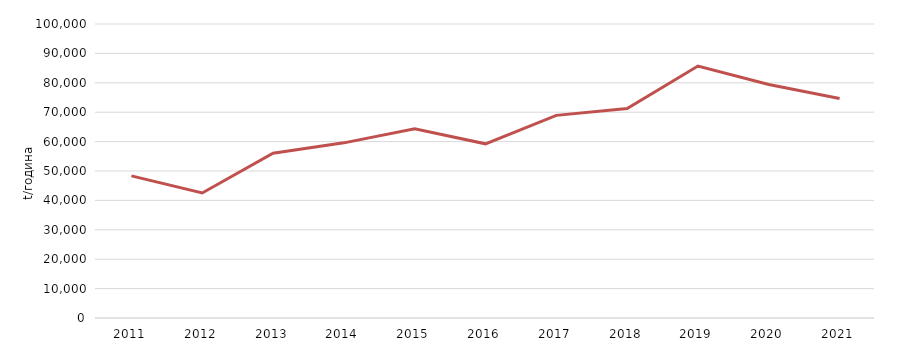
| Category | пакување пуштено на пазар |
|---|---|
| 2011.0 | 48340.83 |
| 2012.0 | 42515.62 |
| 2013.0 | 56043.73 |
| 2014.0 | 59572.83 |
| 2015.0 | 64369.48 |
| 2016.0 | 59243.763 |
| 2017.0 | 68919.71 |
| 2018.0 | 71286.55 |
| 2019.0 | 85718.72 |
| 2020.0 | 79434.49 |
| 2021.0 | 74666.38 |